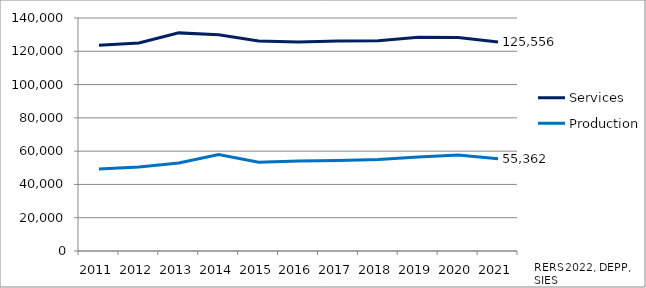
| Category | Services | Production |
|---|---|---|
| 2011.0 | 123667 | 49260 |
| 2012.0 | 124964 | 50458 |
| 2013.0 | 131060 | 52834 |
| 2014.0 | 129897 | 57973 |
| 2015.0 | 126242 | 53369 |
| 2016.0 | 125577 | 54031 |
| 2017.0 | 126235 | 54364 |
| 2018.0 | 126351 | 54962 |
| 2019.0 | 128400 | 56534 |
| 2020.0 | 128248 | 57612 |
| 2021.0 | 125556 | 55362 |